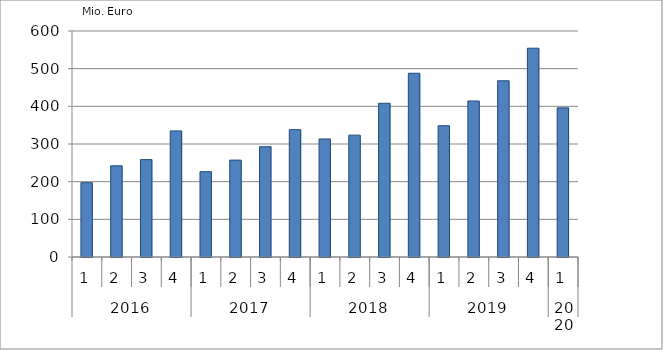
| Category | Ausbaugewerblicher Umsatz3 |
|---|---|
| 0 | 197219.532 |
| 1 | 242069.899 |
| 2 | 258547.84 |
| 3 | 334764.305 |
| 4 | 226552.317 |
| 5 | 257191.13 |
| 6 | 292853.372 |
| 7 | 338154.691 |
| 8 | 313433.569 |
| 9 | 323547.694 |
| 10 | 408057.42 |
| 11 | 487843.765 |
| 12 | 348466.115 |
| 13 | 414145.554 |
| 14 | 467849.207 |
| 15 | 554369.34 |
| 16 | 395996.128 |